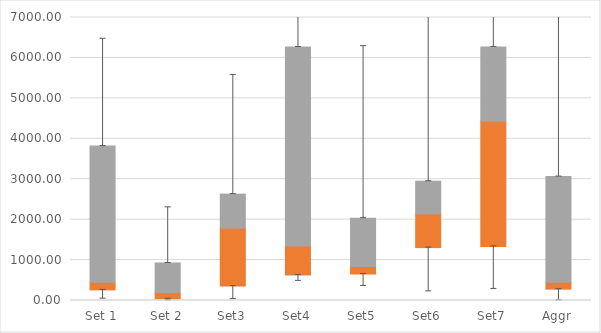
| Category | Q1 | Median-Q1 | Q3-Median |
|---|---|---|---|
| Set 1 | 262.42 | 191.104 | 3366.661 |
| Set 2 | 42.812 | 155.188 | 730.897 |
| Set3 | 356.171 | 1433.594 | 841.4 |
| Set4 | 630.895 | 719.381 | 4921.073 |
| Set5 | 655.027 | 188.585 | 1193.608 |
| Set6 | 1309.227 | 833.346 | 808.744 |
| Set7 | 1338.295 | 3093.709 | 1841.29 |
| Aggr | 280.866 | 172.657 | 2613.06 |